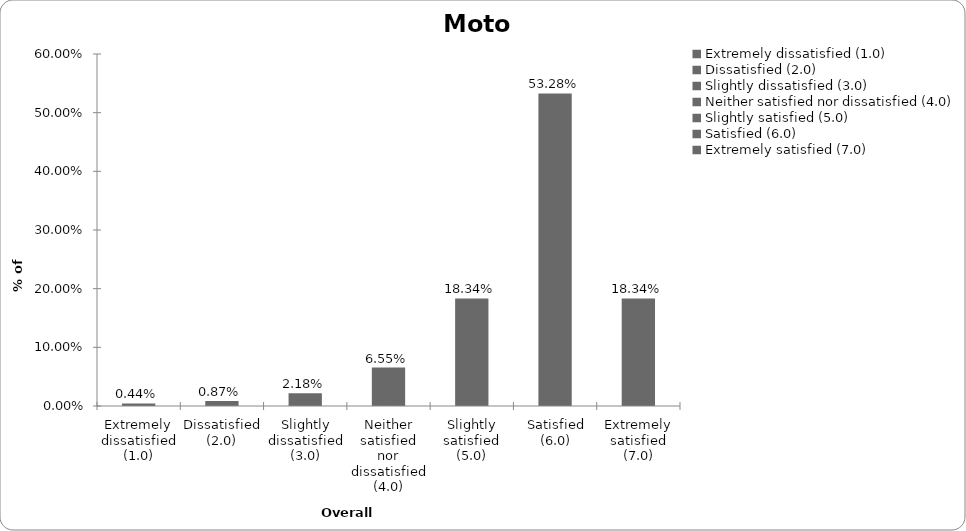
| Category | Motor |
|---|---|
| Extremely dissatisfied (1.0) | 0.004 |
| Dissatisfied (2.0) | 0.009 |
| Slightly dissatisfied (3.0) | 0.022 |
| Neither satisfied nor dissatisfied (4.0) | 0.066 |
| Slightly satisfied (5.0) | 0.183 |
| Satisfied (6.0) | 0.533 |
| Extremely satisfied (7.0) | 0.183 |